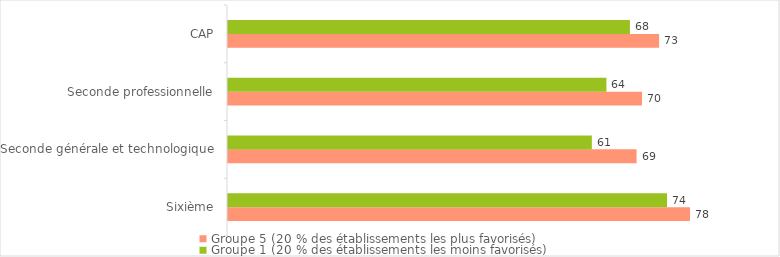
| Category | Groupe 5 (20 % des établissements les plus favorisés) | Groupe 1 (20 % des établissements les moins favorisés) |
|---|---|---|
| Sixième | 77.723 | 73.858 |
| Seconde générale et technologique | 68.736 | 61.21 |
| Seconde professionnelle | 69.649 | 63.66 |
| CAP | 72.522 | 67.611 |